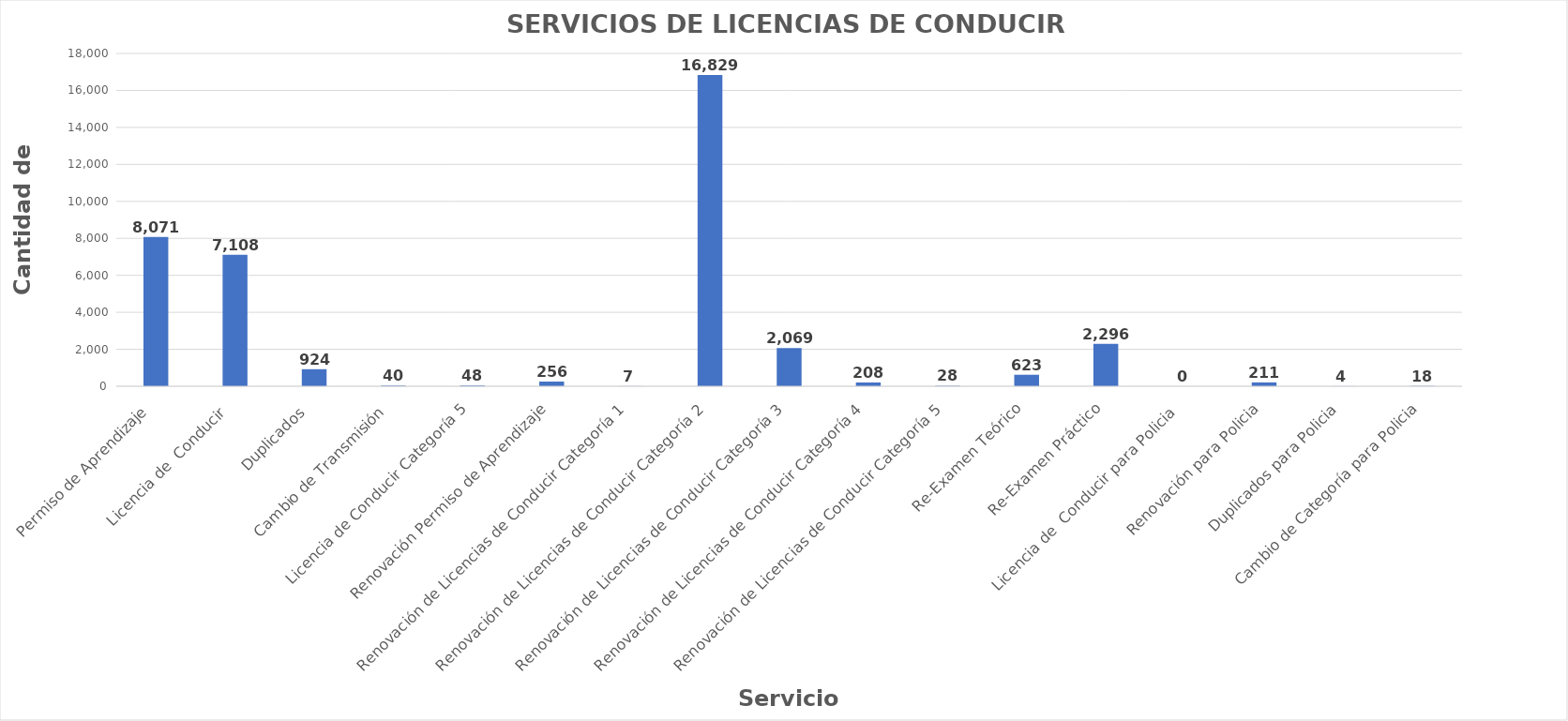
| Category | Series 0 |
|---|---|
| Permiso de Aprendizaje  | 8071 |
| Licencia de  Conducir  | 7108 |
| Duplicados  | 924 |
| Cambio de Transmisión  | 40 |
| Licencia de Conducir Categoría 5 | 48 |
| Renovación Permiso de Aprendizaje | 256 |
| Renovación de Licencias de Conducir Categoría 1 | 7 |
| Renovación de Licencias de Conducir Categoría 2 | 16829 |
| Renovación de Licencias de Conducir Categoría 3 | 2069 |
| Renovación de Licencias de Conducir Categoría 4 | 208 |
| Renovación de Licencias de Conducir Categoría 5 | 28 |
| Re-Examen Teórico | 623 |
| Re-Examen Práctico | 2296 |
| Licencia de  Conducir para Policia  | 0 |
| Renovación para Policia | 211 |
| Duplicados para Policia | 4 |
| Cambio de Categoría para Policia | 18 |